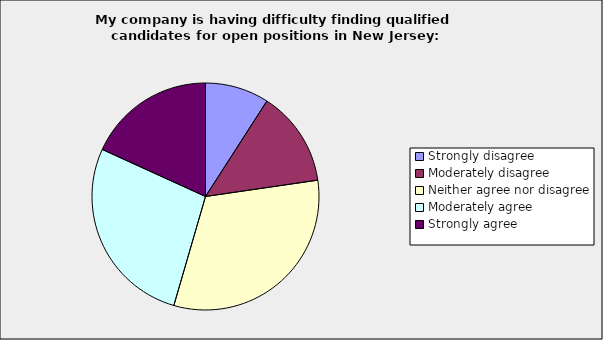
| Category | Series 0 |
|---|---|
| Strongly disagree | 0.091 |
| Moderately disagree | 0.136 |
| Neither agree nor disagree | 0.318 |
| Moderately agree | 0.273 |
| Strongly agree | 0.182 |